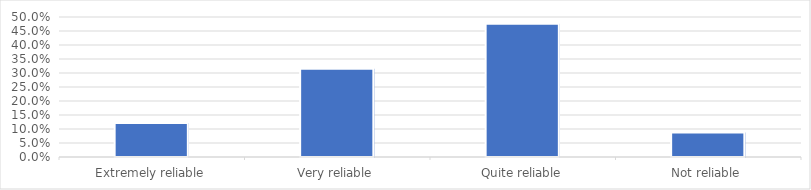
| Category | Series 0 |
|---|---|
| Extremely reliable | 0.121 |
| Very reliable | 0.315 |
| Quite reliable | 0.476 |
| Not reliable | 0.088 |